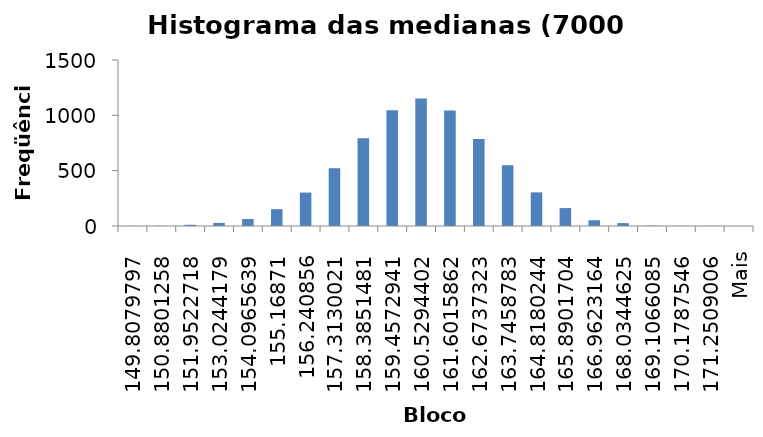
| Category | Freqüência |
|---|---|
| 149.8079797 | 1 |
| 150.8801258 | 2 |
| 151.9522718 | 11 |
| 153.0244179 | 28 |
| 154.0965639 | 63 |
| 155.16871 | 152 |
| 156.240856 | 302 |
| 157.3130021 | 522 |
| 158.3851481 | 792 |
| 159.4572941 | 1046 |
| 160.5294402 | 1153 |
| 161.6015862 | 1044 |
| 162.6737323 | 786 |
| 163.7458783 | 549 |
| 164.8180244 | 304 |
| 165.8901704 | 162 |
| 166.9623164 | 52 |
| 168.0344625 | 26 |
| 169.1066085 | 3 |
| 170.1787546 | 1 |
| 171.2509006 | 1 |
| Mais | 0 |